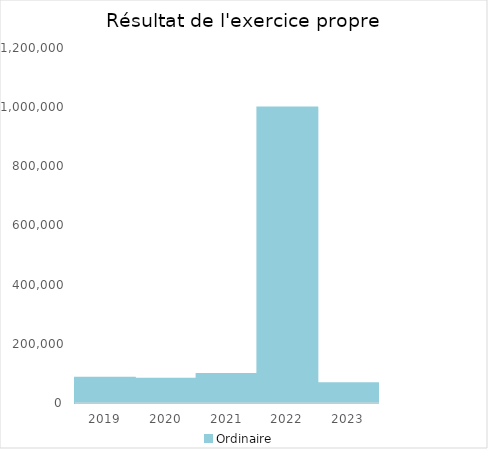
| Category |   | Ordinaire |    |
|---|---|---|---|
| 2019.0 |  | 85035.98 |  |
| 2020.0 |  | 81598.29 |  |
| 2021.0 |  | 98412.75 |  |
| 2022.0 |  | 998691.5 |  |
| 2023.0 |  | 66451.13 |  |